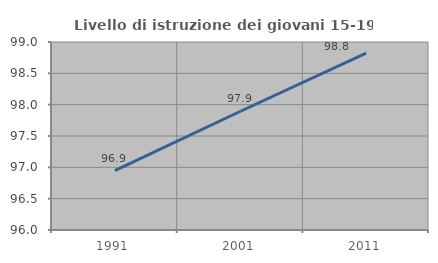
| Category | Livello di istruzione dei giovani 15-19 anni |
|---|---|
| 1991.0 | 96.947 |
| 2001.0 | 97.895 |
| 2011.0 | 98.824 |